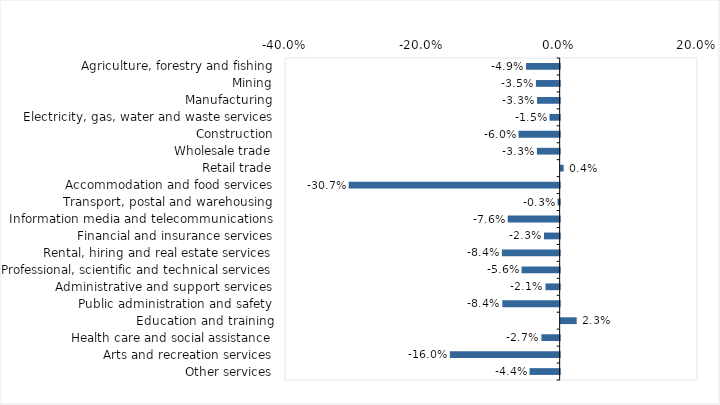
| Category | This week |
|---|---|
| Agriculture, forestry and fishing | -0.049 |
| Mining | -0.035 |
| Manufacturing | -0.033 |
| Electricity, gas, water and waste services | -0.015 |
| Construction | -0.06 |
| Wholesale trade | -0.033 |
| Retail trade | 0.004 |
| Accommodation and food services | -0.307 |
| Transport, postal and warehousing | -0.003 |
| Information media and telecommunications | -0.076 |
| Financial and insurance services | -0.023 |
| Rental, hiring and real estate services | -0.084 |
| Professional, scientific and technical services | -0.056 |
| Administrative and support services | -0.021 |
| Public administration and safety | -0.084 |
| Education and training | 0.023 |
| Health care and social assistance | -0.027 |
| Arts and recreation services | -0.16 |
| Other services | -0.044 |